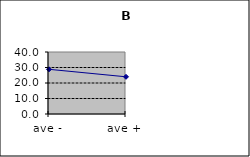
| Category | Series 0 |
|---|---|
| ave - | 28.833 |
| ave + | 24 |